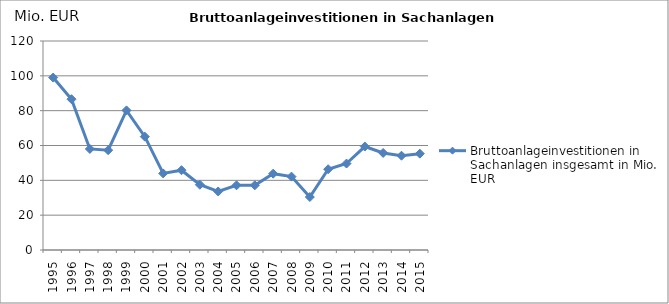
| Category | Bruttoanlageinvestitionen in Sachanlagen insgesamt in Mio. EUR |
|---|---|
| 1995.0 | 99 |
| 1996.0 | 86.587 |
| 1997.0 | 58.03 |
| 1998.0 | 57.307 |
| 1999.0 | 80.155 |
| 2000.0 | 65.078 |
| 2001.0 | 43.973 |
| 2002.0 | 45.812 |
| 2003.0 | 37.496 |
| 2004.0 | 33.615 |
| 2005.0 | 37.159 |
| 2006.0 | 37.16 |
| 2007.0 | 43.825 |
| 2008.0 | 42.134 |
| 2009.0 | 30.418 |
| 2010.0 | 46.387 |
| 2011.0 | 49.643 |
| 2012.0 | 59.396 |
| 2013.0 | 55.726 |
| 2014.0 | 54.126 |
| 2015.0 | 55.311 |